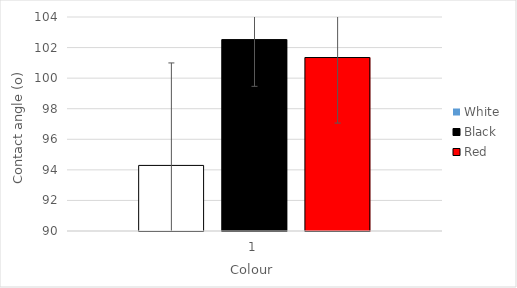
| Category | White | Black | Red |
|---|---|---|---|
| 0 | 94.291 | 102.521 | 101.349 |